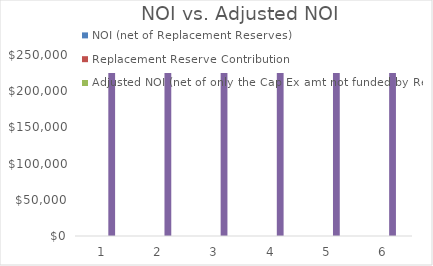
| Category | NOI (net of Replacement Reserves) | Replacement Reserve Contribution | Adjusted NOI (net of only the Cap Ex amt not funded by Reserves) | Year-End Reserve Balance | Cap Ex |
|---|---|---|---|---|---|
| 0 | 0 | 0 | 0 | 225000 | 0 |
| 1 | 0 | 0 | 0 | 225000 | 0 |
| 2 | 0 | 0 | 0 | 225000 | 0 |
| 3 | 0 | 0 | 0 | 225000 | 0 |
| 4 | 0 | 0 | 0 | 225000 | 0 |
| 5 | 0 | 0 | 0 | 225000 | 0 |